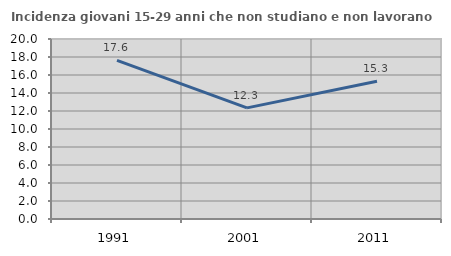
| Category | Incidenza giovani 15-29 anni che non studiano e non lavorano  |
|---|---|
| 1991.0 | 17.622 |
| 2001.0 | 12.346 |
| 2011.0 | 15.306 |